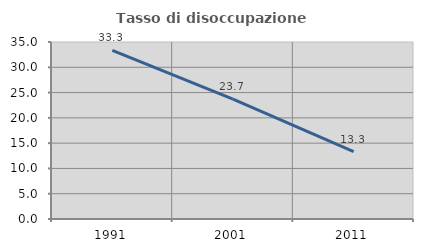
| Category | Tasso di disoccupazione giovanile  |
|---|---|
| 1991.0 | 33.333 |
| 2001.0 | 23.711 |
| 2011.0 | 13.333 |